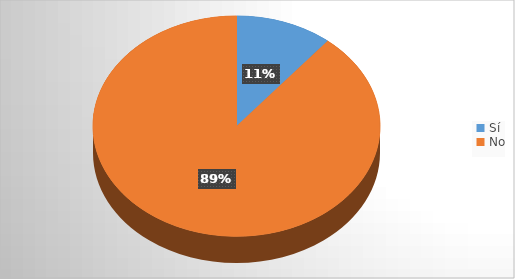
| Category | Series 0 |
|---|---|
| Sí | 13 |
| No | 106 |